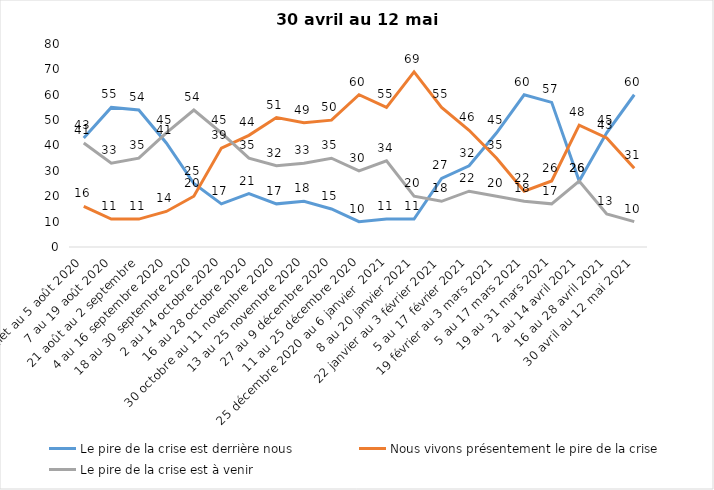
| Category | Le pire de la crise est derrière nous | Nous vivons présentement le pire de la crise | Le pire de la crise est à venir |
|---|---|---|---|
| 24 juillet au 5 août 2020 | 43 | 16 | 41 |
| 7 au 19 août 2020 | 55 | 11 | 33 |
| 21 août au 2 septembre | 54 | 11 | 35 |
| 4 au 16 septembre 2020 | 41 | 14 | 45 |
| 18 au 30 septembre 2020 | 25 | 20 | 54 |
| 2 au 14 octobre 2020 | 17 | 39 | 45 |
| 16 au 28 octobre 2020 | 21 | 44 | 35 |
| 30 octobre au 11 novembre 2020 | 17 | 51 | 32 |
| 13 au 25 novembre 2020 | 18 | 49 | 33 |
| 27 au 9 décembre 2020 | 15 | 50 | 35 |
| 11 au 25 décembre 2020 | 10 | 60 | 30 |
| 25 décembre 2020 au 6 janvier  2021 | 11 | 55 | 34 |
| 8 au 20 janvier 2021 | 11 | 69 | 20 |
| 22 janvier au 3 février 2021 | 27 | 55 | 18 |
| 5 au 17 février 2021 | 32 | 46 | 22 |
| 19 février au 3 mars 2021 | 45 | 35 | 20 |
| 5 au 17 mars 2021 | 60 | 22 | 18 |
| 19 au 31 mars 2021 | 57 | 26 | 17 |
| 2 au 14 avril 2021 | 26 | 48 | 26 |
| 16 au 28 avril 2021 | 45 | 43 | 13 |
| 30 avril au 12 mai 2021 | 60 | 31 | 10 |